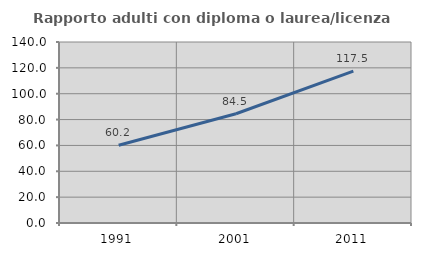
| Category | Rapporto adulti con diploma o laurea/licenza media  |
|---|---|
| 1991.0 | 60.152 |
| 2001.0 | 84.507 |
| 2011.0 | 117.467 |